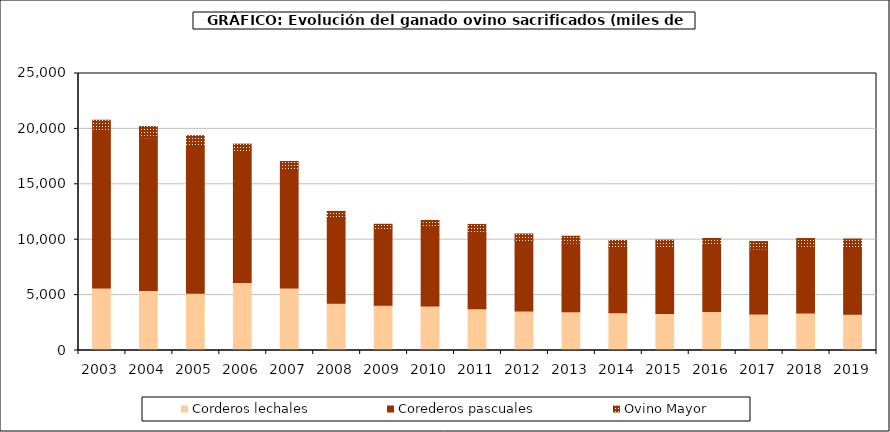
| Category | Corderos lechales | Corederos pascuales | Ovino Mayor |
|---|---|---|---|
| 2003.0 | 5637.335 | 14297.108 | 847.747 |
| 2004.0 | 5404.652 | 13795.131 | 1014.334 |
| 2005.0 | 5162.599 | 13334.056 | 894.122 |
| 2006.0 | 6135.816 | 11899.5 | 588.049 |
| 2007.0 | 5636.95 | 10753.897 | 671.584 |
| 2008.0 | 4274.009 | 7680.583 | 601.312 |
| 2009.0 | 4077.718 | 6912.598 | 401.948 |
| 2010.0 | 4025.011 | 7225.191 | 485.795 |
| 2011.0 | 3766.943 | 6823.433 | 786.919 |
| 2012.0 | 3554.891 | 6323.737 | 640.04 |
| 2013.0 | 3505.325 | 6199.853 | 606.859 |
| 2014.0 | 3401.013 | 5885.403 | 641.775 |
| 2015.0 | 3343.808 | 6007.202 | 609.166 |
| 2016.0 | 3523.522 | 5979.25 | 609.555 |
| 2017.0 | 3300.962 | 5860.838 | 671.326 |
| 2018.0 | 3387.073 | 6019.548 | 699.086 |
| 2019.0 | 3280.557 | 6058.916 | 720.572 |